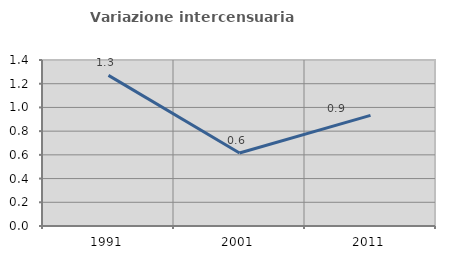
| Category | Variazione intercensuaria annua |
|---|---|
| 1991.0 | 1.271 |
| 2001.0 | 0.615 |
| 2011.0 | 0.933 |